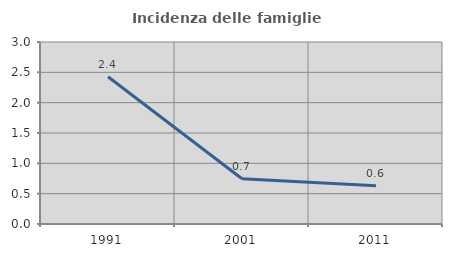
| Category | Incidenza delle famiglie numerose |
|---|---|
| 1991.0 | 2.428 |
| 2001.0 | 0.745 |
| 2011.0 | 0.629 |